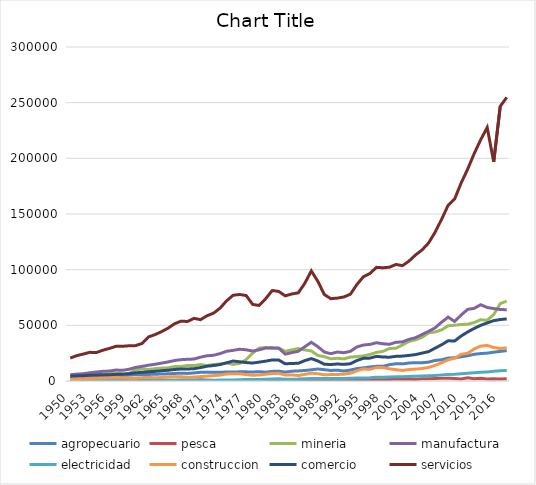
| Category | agropecuario | pesca | mineria | manufactura | electricidad | construccion | comercio | servicios |
|---|---|---|---|---|---|---|---|---|
| 1950.0 | 4486 | 45 | 4220 | 5630 | 123 | 1527 | 4303 | 20586 |
| 1951.0 | 4621 | 47 | 4553 | 6192 | 127 | 1794 | 4575 | 22802 |
| 1952.0 | 4755 | 51 | 4704 | 6525 | 132 | 2216 | 4764 | 24200 |
| 1953.0 | 4865 | 44 | 4431 | 7370 | 166 | 2336 | 5123 | 25750 |
| 1954.0 | 4962 | 58 | 5920 | 8067 | 169 | 2623 | 5430 | 25533 |
| 1955.0 | 4922 | 68 | 5961 | 8673 | 184 | 2778 | 5634 | 27638 |
| 1956.0 | 4686 | 85 | 6593 | 8939 | 196 | 3111 | 5619 | 29255 |
| 1957.0 | 4705 | 95 | 7226 | 9853 | 221 | 3195 | 5965 | 31111 |
| 1958.0 | 5030 | 142 | 6546 | 9589 | 250 | 2901 | 6048 | 31200 |
| 1959.0 | 5276 | 229 | 6690 | 10486 | 252 | 2556 | 6529 | 31635 |
| 1960.0 | 5614 | 312 | 10002 | 12162 | 289 | 2453 | 7337 | 31777 |
| 1961.0 | 5782 | 440 | 10932 | 13108 | 359 | 3015 | 7811 | 33638 |
| 1962.0 | 5921 | 567 | 10396 | 14185 | 374 | 3289 | 8318 | 39570 |
| 1963.0 | 6010 | 591 | 11062 | 14985 | 398 | 2842 | 8662 | 41646 |
| 1964.0 | 6305 | 762 | 11615 | 16037 | 425 | 3143 | 9253 | 44300 |
| 1965.0 | 6431 | 630 | 11789 | 17092 | 460 | 3552 | 9652 | 47397 |
| 1966.0 | 6778 | 744 | 12944 | 18415 | 501 | 3868 | 10348 | 51397 |
| 1967.0 | 7042 | 849 | 13100 | 19141 | 548 | 3845 | 10782 | 53733 |
| 1968.0 | 6803 | 864 | 13912 | 19505 | 579 | 3291 | 10800 | 53452 |
| 1969.0 | 7252 | 776 | 13815 | 19725 | 608 | 3512 | 11072 | 56284 |
| 1970.0 | 7818 | 1031 | 14796 | 21423 | 636 | 3989 | 12065 | 55091 |
| 1971.0 | 7975 | 711 | 13897 | 22642 | 705 | 4357 | 13296 | 58630 |
| 1972.0 | 7784 | 378 | 14767 | 23111 | 768 | 4825 | 13891 | 60939 |
| 1973.0 | 7815 | 274 | 15326 | 24615 | 856 | 5285 | 14763 | 65467 |
| 1974.0 | 8104 | 383 | 16179 | 26689 | 936 | 6353 | 16357 | 72016 |
| 1975.0 | 8101 | 340 | 14924 | 27523 | 1008 | 6488 | 17929 | 77027 |
| 1976.0 | 8222 | 400 | 15816 | 28519 | 1145 | 6493 | 17256 | 77708 |
| 1977.0 | 8214 | 349 | 19116 | 28037 | 1292 | 5763 | 16559 | 76772 |
| 1978.0 | 8091 | 441 | 25101 | 26906 | 1346 | 5169 | 16141 | 68782 |
| 1979.0 | 8406 | 494 | 29554 | 28021 | 1444 | 5439 | 16967 | 67869 |
| 1980.0 | 7917 | 412 | 30171 | 29628 | 1644 | 6064 | 17818 | 73942 |
| 1981.0 | 8633 | 450 | 29243 | 29827 | 1765 | 6745 | 18944 | 81294 |
| 1982.0 | 8824 | 528 | 29603 | 29477 | 1909 | 6880 | 18839 | 80447 |
| 1983.0 | 7974 | 371 | 26698 | 24128 | 1603 | 5447 | 15440 | 76475 |
| 1984.0 | 8790 | 543 | 27973 | 25510 | 1608 | 5491 | 15764 | 78163 |
| 1985.0 | 9046 | 636 | 29175 | 26659 | 1707 | 4915 | 15893 | 79188 |
| 1986.0 | 9438 | 840 | 27868 | 30817 | 2007 | 5966 | 18309 | 87736 |
| 1987.0 | 10060 | 740 | 27036 | 34765 | 2162 | 7024 | 20109 | 98882 |
| 1988.0 | 10772 | 876 | 22984 | 30869 | 2173 | 6549 | 18013 | 89586 |
| 1989.0 | 10169 | 922 | 21865 | 26034 | 2144 | 5587 | 15055 | 77660 |
| 1990.0 | 9463 | 916 | 19965 | 24524 | 2152 | 5764 | 14790 | 73918 |
| 1991.0 | 9762 | 818 | 20390 | 26038 | 2237 | 5862 | 15296 | 74451 |
| 1992.0 | 9010 | 923 | 19860 | 25421 | 2285 | 6119 | 14922 | 75477 |
| 1993.0 | 9845 | 1117 | 21478 | 26643 | 2532 | 6996 | 15511 | 77971 |
| 1994.0 | 11156 | 1440 | 21896 | 30583.023 | 2761 | 9171.65 | 18381.001 | 86654.998 |
| 1995.0 | 11842 | 1223 | 22532 | 32311.988 | 2773 | 10804.004 | 20379.001 | 93670.998 |
| 1996.0 | 12611 | 1195 | 23802 | 32878.979 | 2919 | 10501.312 | 20556.001 | 96545.998 |
| 1997.0 | 13160 | 1191 | 25718 | 34365.042 | 3310 | 12066.251 | 22125.001 | 102092.998 |
| 1998.0 | 13177 | 1076 | 26643 | 33425.048 | 3465 | 12162.947 | 21543.001 | 101697.998 |
| 1999.0 | 14646 | 1428 | 29184 | 32961.967 | 3620 | 10933.775 | 21366.001 | 102236.998 |
| 2000.0 | 15496 | 1710 | 29440 | 34792.048 | 3750 | 10168.661 | 22173.001 | 104676.998 |
| 2001.0 | 15374 | 1488 | 32360 | 35093.952 | 3823 | 9466.525 | 22353.001 | 103621.098 |
| 2002.0 | 16152 | 1529 | 35582 | 37423.859 | 4049 | 10281.09 | 23010.001 | 107745.998 |
| 2003.0 | 16472 | 1417 | 36993 | 38882.964 | 4205 | 10671.652 | 23710.001 | 113240.998 |
| 2004.0 | 16391 | 1988 | 39206 | 41777.958 | 4435 | 11194.83 | 25075.001 | 117701.998 |
| 2005.0 | 16948 | 2086.001 | 43236 | 44529.133 | 4684.999 | 12168.023 | 26368.001 | 123950.997 |
| 2006.0 | 18462 | 2163.001 | 44058 | 47765.973 | 5039.999 | 13993.859 | 29500.001 | 133614.997 |
| 2007.0 | 19074.001 | 2364.001 | 45892 | 52807 | 5504.999 | 16317.001 | 32537.001 | 145196.996 |
| 2008.0 | 20600.001 | 2435.999 | 49599.001 | 57354.001 | 5949.999 | 19061.001 | 36105.001 | 157818.001 |
| 2009.0 | 20873.001 | 2352 | 50076 | 53502.018 | 6013 | 20359.999 | 35936 | 163471.999 |
| 2010.0 | 21766.001 | 1891.001 | 50714.002 | 59254.999 | 6501 | 23993.001 | 40419.999 | 177839.997 |
| 2011.0 | 22658 | 2891.999 | 51043.001 | 64329.989 | 6994 | 24848 | 44034 | 190252.994 |
| 2012.0 | 23991.78 | 1960.001 | 52473 | 65264.99 | 7401.001 | 28779 | 47217.999 | 204185.215 |
| 2013.0 | 24639.821 | 2445.133 | 55034.968 | 68507.767 | 7803.764 | 31356.222 | 49984.323 | 216676.721 |
| 2014.0 | 25027.696 | 1762.068 | 54554.266 | 66047.136 | 8185.488 | 31960.101 | 52192.746 | 227703.304 |
| 2015.0 | 25893.987 | 2041.676 | 59715.574 | 65079.329 | 8671.203 | 30100.823 | 54216.598 | 196800.792 |
| 2016.0 | 26583.878 | 1835.735 | 69445.817 | 64187.195 | 9306.453 | 29189.626 | 55198.885 | 246632.806 |
| 2017.0 | 27282.047 | 1921.445 | 71822.799 | 64032.635 | 9412.463 | 29798.266 | 55767.048 | 254733.982 |